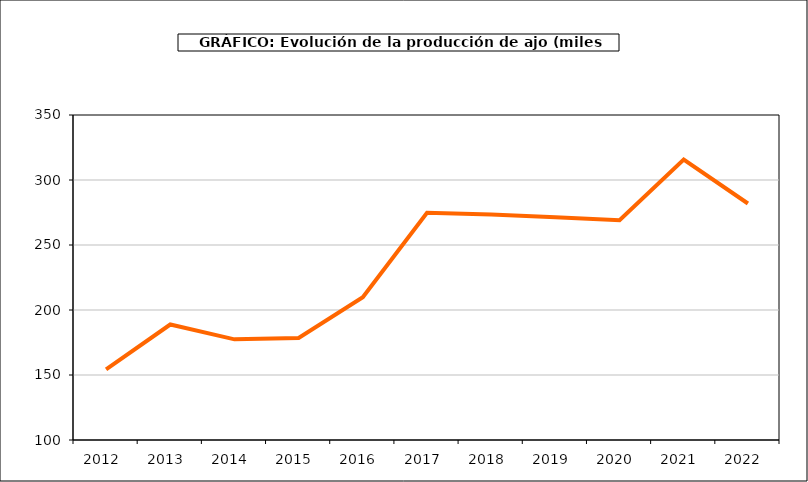
| Category | producción |
|---|---|
| 2012.0 | 154.363 |
| 2013.0 | 188.84 |
| 2014.0 | 177.427 |
| 2015.0 | 178.416 |
| 2016.0 | 209.795 |
| 2017.0 | 274.712 |
| 2018.0 | 273.476 |
| 2019.0 | 271.353 |
| 2020.0 | 269.094 |
| 2021.0 | 315.723 |
| 2022.0 | 281.904 |